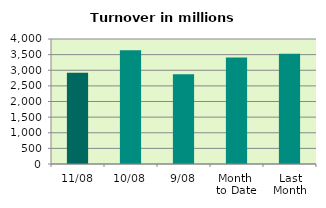
| Category | Series 0 |
|---|---|
| 11/08 | 2916.384 |
| 10/08 | 3638.957 |
| 9/08 | 2873.73 |
| Month 
to Date | 3406.233 |
| Last
Month | 3531.02 |